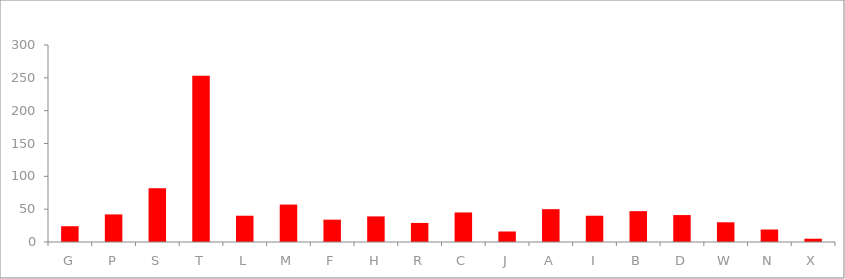
| Category | Count |
|---|---|
| G | 24 |
| P | 42 |
| S | 82 |
| T | 253 |
| L | 40 |
| M | 57 |
| F | 34 |
| H | 39 |
| R | 29 |
| C | 45 |
| J | 16 |
| A | 50 |
| I | 40 |
| B | 47 |
| D | 41 |
| W | 30 |
| N | 19 |
| X | 5 |